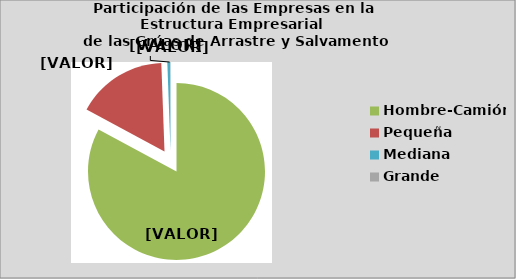
| Category | Series 0 |
|---|---|
| Hombre-Camión | 82.853 |
| Pequeña | 16.571 |
| Mediana | 0.544 |
| Grande | 0.032 |